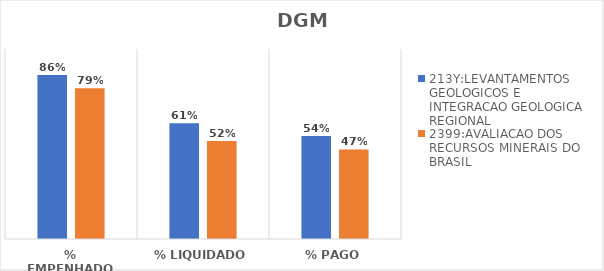
| Category | 213Y:LEVANTAMENTOS GEOLOGICOS E INTEGRACAO GEOLOGICA REGIONAL | 2399:AVALIACAO DOS RECURSOS MINERAIS DO BRASIL |
|---|---|---|
| % EMPENHADO | 0.864 | 0.793 |
| % LIQUIDADO | 0.61 | 0.516 |
| % PAGO | 0.542 | 0.471 |